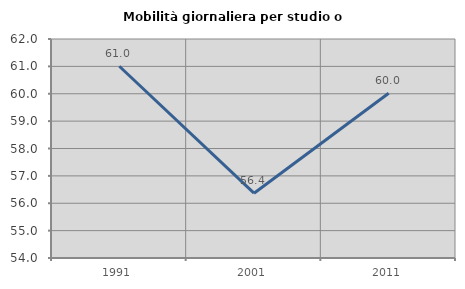
| Category | Mobilità giornaliera per studio o lavoro |
|---|---|
| 1991.0 | 61.004 |
| 2001.0 | 56.368 |
| 2011.0 | 60.018 |